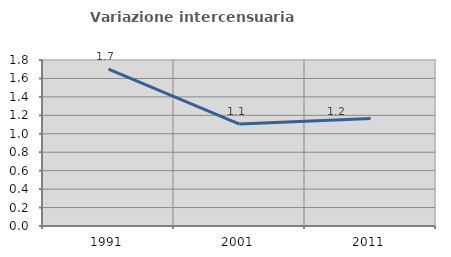
| Category | Variazione intercensuaria annua |
|---|---|
| 1991.0 | 1.701 |
| 2001.0 | 1.106 |
| 2011.0 | 1.166 |